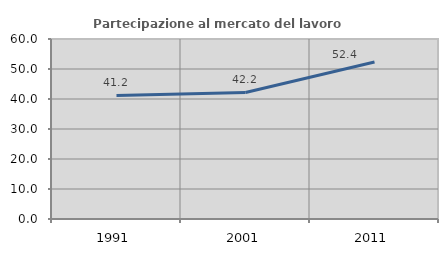
| Category | Partecipazione al mercato del lavoro  femminile |
|---|---|
| 1991.0 | 41.207 |
| 2001.0 | 42.188 |
| 2011.0 | 52.357 |